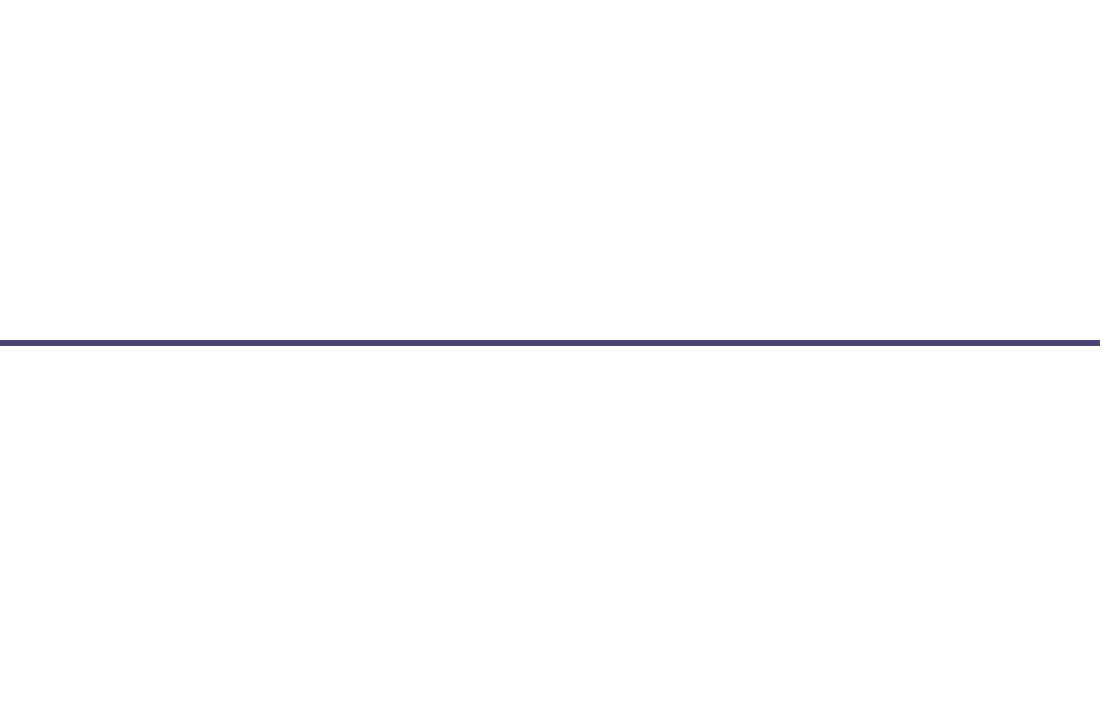
| Category | Vị trí |
|---|---|
| 0 | 1 |
| 1 | -2 |
| 2 | 1 |
| 3 | -1 |
| 4 | -0.5 |
| 5 | 2 |
| 6 | 0.5 |
| 7 | -1 |
| 8 | 0.5 |
| 9 | -2 |